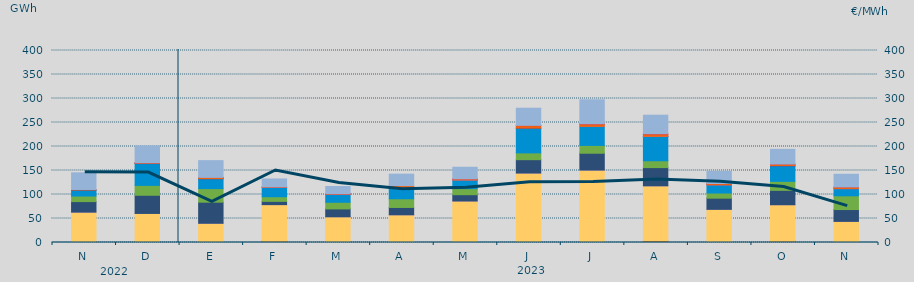
| Category | Carbón | Ciclo Combinado | Cogeneración | Consumo Bombeo | Eólica | Hidráulica | Nuclear | Otras Renovables | Solar fotovoltaica | Solar térmica | Turbinación bombeo |
|---|---|---|---|---|---|---|---|---|---|---|---|
| N | 1396.025 | 61724.955 | 198.008 | 21869.975 | 11579.495 | 12449.175 | 266.725 | 0 | 996.225 | 0 | 34713.224 |
| D | 1126.208 | 59335.684 | 104.85 | 37837.8 | 20596.98 | 45465.168 | 544.3 | 0 | 1011.875 | 1.5 | 35471.986 |
| E | 478.95 | 39560.875 | 26.867 | 43909.242 | 28275.092 | 20601.292 | 143.6 | 0 | 2603.242 | 1.5 | 34937.333 |
| F | 2850.925 | 76083.275 | 1.55 | 6739.65 | 9661.175 | 19240.1 | 0 | 0 | 962.675 | 47.25 | 16781.025 |
| M | 1195.025 | 52392.533 | 3.3 | 16393.158 | 13789.6 | 16980.517 | 40.625 | 4.5 | 911.6 | 43.15 | 14940.475 |
| A | 218.875 | 57485.65 | 46.225 | 15258.175 | 18096.25 | 24086.65 | 63.45 | 0 | 3316.075 | 0 | 23819.559 |
| M | 150.482 | 86315.465 | 30 | 13099.874 | 12607.441 | 17784.926 | 256.325 | 2 | 2256.963 | 1.5 | 24199.004 |
| J | 1968.975 | 142738.351 | 35.225 | 27797.375 | 14167.175 | 51399.925 | 228.125 | 0 | 5290.65 | 319.5 | 35835.25 |
| J | 1606.69 | 149175.946 | 137.975 | 35048.925 | 16290.2 | 39637.497 | 0 | 5 | 4774.95 | 398.125 | 50276.3 |
| A | 2991.569 | 115032.711 | 108.25 | 37912.341 | 14171.547 | 50649.252 | 261.175 | 69.9 | 4696.2 | 414.625 | 38918.209 |
| S | 1098.882 | 67978.9 | 0.25 | 23304.2 | 10673.95 | 16895.894 | 188.6 | 32.7 | 2616.325 | 77.25 | 25361.951 |
| O | 2715.032 | 75984.499 | 16.5 | 29926.75 | 18741.87 | 32145.415 | 710.65 | 39.9 | 2928.133 | 55.25 | 30795.542 |
| N | 172.117 | 43840.328 | 7.5 | 24632.584 | 28628.29 | 14889.19 | 70.15 | 31.25 | 3231.232 | 0.75 | 26664.945 |